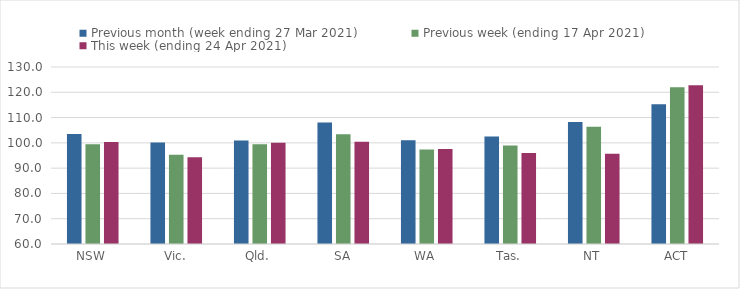
| Category | Previous month (week ending 27 Mar 2021) | Previous week (ending 17 Apr 2021) | This week (ending 24 Apr 2021) |
|---|---|---|---|
| NSW | 103.55 | 99.4 | 100.38 |
| Vic. | 100.13 | 95.29 | 94.33 |
| Qld. | 100.91 | 99.48 | 100.06 |
| SA | 108.06 | 103.37 | 100.46 |
| WA | 101.01 | 97.34 | 97.61 |
| Tas. | 102.5 | 98.93 | 95.98 |
| NT | 108.21 | 106.41 | 95.72 |
| ACT | 115.25 | 122.03 | 122.75 |